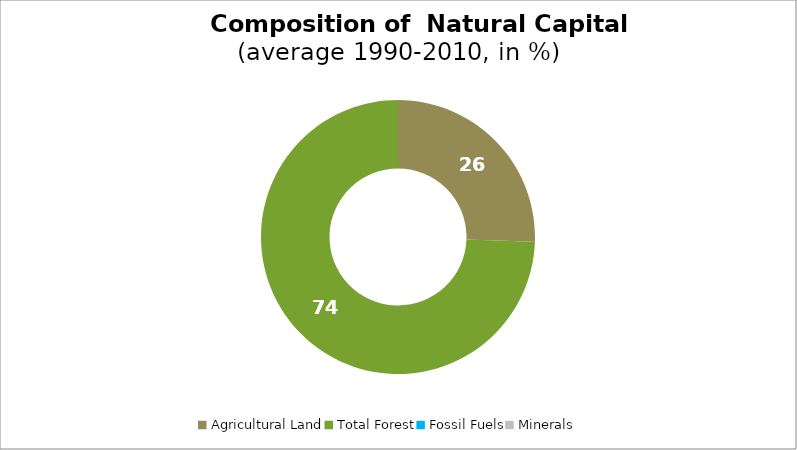
| Category | Series 0 |
|---|---|
| Agricultural Land | 25.557 |
| Total Forest | 74.443 |
| Fossil Fuels | 0 |
| Minerals | 0 |